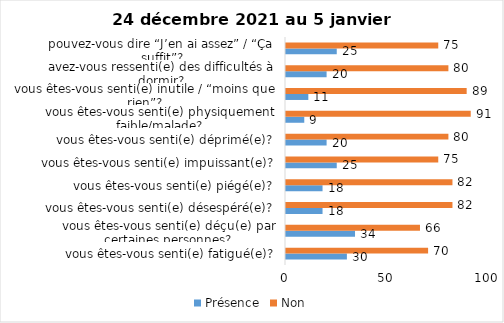
| Category | Présence | Non |
|---|---|---|
| vous êtes-vous senti(e) fatigué(e)? | 30 | 70 |
| vous êtes-vous senti(e) déçu(e) par certaines personnes? | 34 | 66 |
| vous êtes-vous senti(e) désespéré(e)? | 18 | 82 |
| vous êtes-vous senti(e) piégé(e)? | 18 | 82 |
| vous êtes-vous senti(e) impuissant(e)? | 25 | 75 |
| vous êtes-vous senti(e) déprimé(e)? | 20 | 80 |
| vous êtes-vous senti(e) physiquement faible/malade? | 9 | 91 |
| vous êtes-vous senti(e) inutile / “moins que rien”? | 11 | 89 |
| avez-vous ressenti(e) des difficultés à dormir? | 20 | 80 |
| pouvez-vous dire “J’en ai assez” / “Ça suffit”? | 25 | 75 |